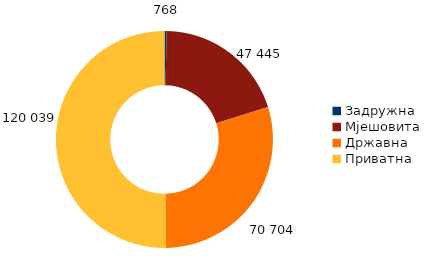
| Category | 0 |
|---|---|
| Задружна | 768 |
| Мјешовита | 47445 |
| Државна | 70704 |
| Приватна | 120039 |